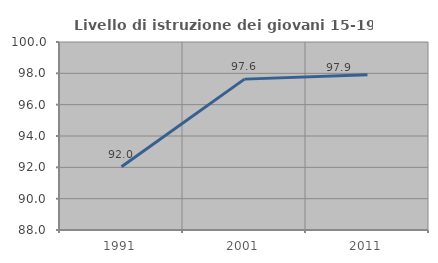
| Category | Livello di istruzione dei giovani 15-19 anni |
|---|---|
| 1991.0 | 92.042 |
| 2001.0 | 97.63 |
| 2011.0 | 97.904 |